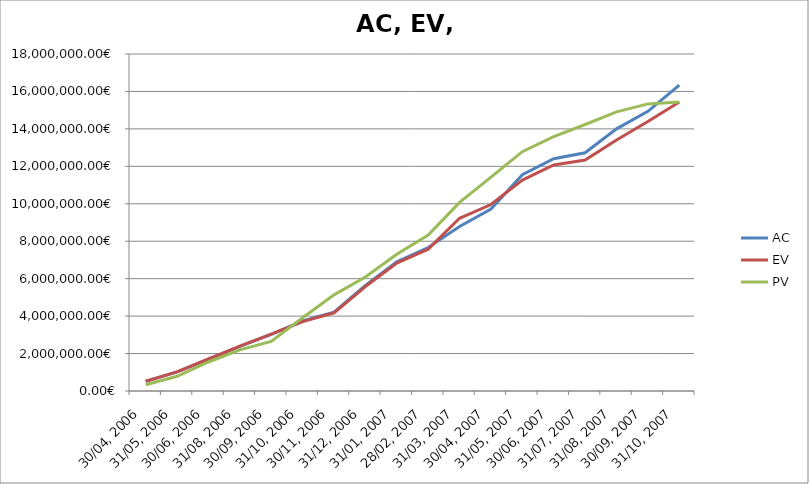
| Category | AC | EV | PV |
|---|---|---|---|
| 30/04, 2006 | 515899.642 | 521532.042 | 335591.041 |
| 31/05, 2006 | 1019680.847 | 1023378.141 | 785117.92 |
| 30/06, 2006 | 1695132.388 | 1708582.504 | 1550157.606 |
| 31/08, 2006 | 2384409.691 | 2392801.591 | 2194453.376 |
| 30/09, 2006 | 3022387.875 | 3042114.279 | 2652903.45 |
| 31/10, 2006 | 3738623.499 | 3709426.396 | 3908923.774 |
| 30/11, 2006 | 4212580.393 | 4177440.679 | 5133728.744 |
| 31/12, 2006 | 5643738.287 | 5582046.894 | 6086409.883 |
| 31/01, 2007 | 6894675.779 | 6834440.122 | 7304968.786 |
| 28/02, 2007 | 7665293.11 | 7574280.91 | 8327449.043 |
| 31/03, 2007 | 8788952.146 | 9225140.752 | 10071796.819 |
| 30/04, 2007 | 9715403.245 | 9959349.036 | 11422569.388 |
| 31/05, 2007 | 11552951.93 | 11262579.325 | 12782984.178 |
| 30/06, 2007 | 12407618.201 | 12072241.321 | 13585278.982 |
| 31/07, 2007 | 12724860.799 | 12335087.559 | 14234388.112 |
| 31/08, 2007 | 14001456.054 | 13409942.238 | 14907850.841 |
| 30/09, 2007 | 14936088.701 | 14397407.227 | 15335575.886 |
| 31/10, 2007 | 16338027.197 | 15440865.89 | 15440865.89 |